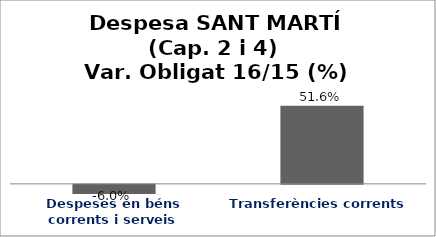
| Category | Series 0 |
|---|---|
| Despeses en béns corrents i serveis | -0.06 |
| Transferències corrents | 0.516 |